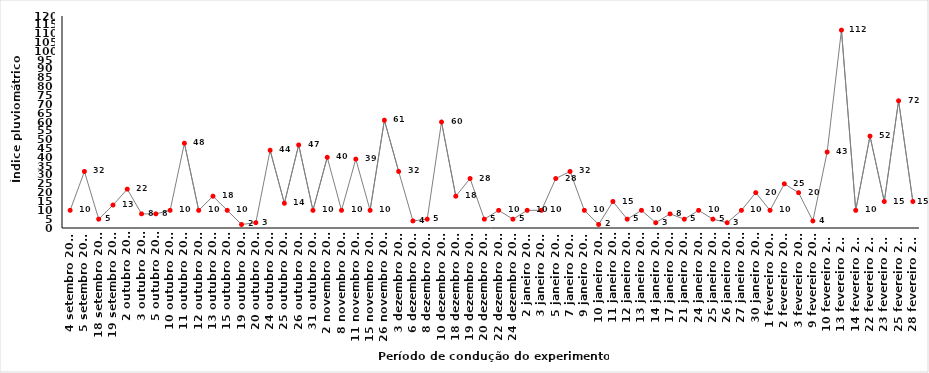
| Category | P. ocorrida |
|---|---|
| 4 setembro 2016 | 10 |
| 5 setembro 2016 | 32 |
| 18 setembro 2016 | 5 |
| 19 setembro 2016 | 13 |
| 2 outubro 2016 | 22 |
| 3 outubro 2016 | 8 |
| 5 outubro 2016 | 8 |
| 10 outubro 2016 | 10 |
| 11 outubro 2016 | 48 |
| 12 outubro 2016 | 10 |
| 13 outubro 2016 | 18 |
| 15 outubro 2016 | 10 |
| 19 outubro 2016 | 2 |
| 20 outubro 2016 | 3 |
| 24 outubro 2016 | 44 |
| 25 outubro 2016 | 14 |
| 26 outubro 2016 | 47 |
| 31 outubro 2016 | 10 |
| 2 novembro 2016 | 40 |
| 8 novembro 2016 | 10 |
| 11 novembro 2016 | 39 |
| 15 novembro 2016 | 10 |
| 26 novembro 2016 | 61 |
| 3 dezembro 2016 | 32 |
| 6 dezembro 2016 | 4 |
| 8 dezembro 2016 | 5 |
| 10 dezembro 2016 | 60 |
| 18 dezembro 2016 | 18 |
| 19 dezembro 2016 | 28 |
| 20 dezembro 2016 | 5 |
| 22 dezembro 2016 | 10 |
| 24 dezembro 2016 | 5 |
| 2 janeiro 2017 | 10 |
| 3 janeiro 2017 | 10 |
| 5 janeiro 2017 | 28 |
| 7 janeiro 2017 | 32 |
| 9 janeiro 2017 | 10 |
| 10 janeiro 2017 | 2 |
| 11 janeiro 2017 | 15 |
| 12 janeiro 2017 | 5 |
| 13 janeiro 2017 | 10 |
| 14 janeiro 2017 | 3 |
| 17 janeiro 2017 | 8 |
| 21 janeiro 2017 | 5 |
| 24 janeiro 2017 | 10 |
| 25 janeiro 2017 | 5 |
| 26 janeiro 2017 | 3 |
| 27 janeiro 2017 | 10 |
| 30 janeiro 2017 | 20 |
| 1 fevereiro 2017 | 10 |
| 2 fevereiro 2017 | 25 |
| 3 fevereiro 2017 | 20 |
| 9 fevereiro 2017 | 4 |
| 10 fevereiro 2017 | 43 |
| 13 fevereiro 2017 | 112 |
| 14 fevereiro 2017 | 10 |
| 22 fevereiro 2017 | 52 |
| 23 fevereiro 2017 | 15 |
| 25 fevereiro 2017 | 72 |
| 28 fevereiro 2017 | 15 |